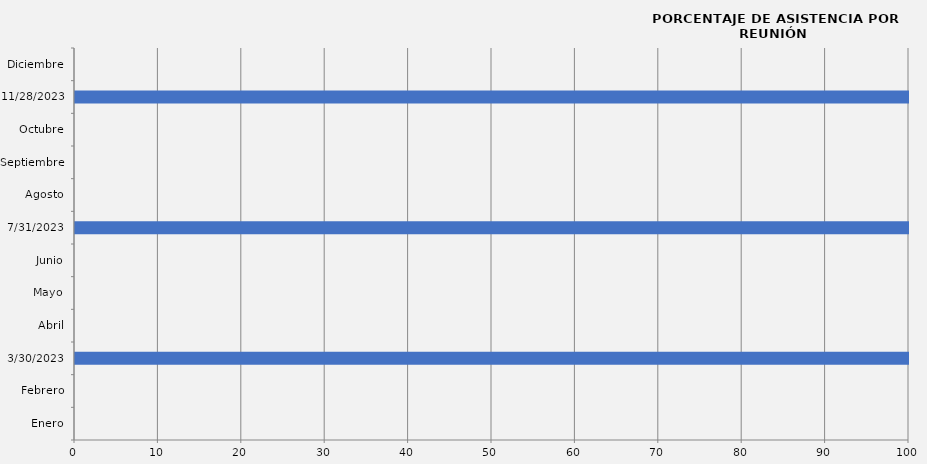
| Category | Series 0 |
|---|---|
| Enero | 0 |
| Febrero | 0 |
| 30/03/2023 | 100 |
| Abril | 0 |
| Mayo | 0 |
| Junio | 0 |
| 31/07/2023 | 100 |
| Agosto | 0 |
| Septiembre | 0 |
| Octubre | 0 |
| 28/11/2023 | 100 |
| Diciembre | 0 |